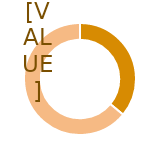
| Category | Series 0 |
|---|---|
| 0 | 0.36 |
| 1 | 0.64 |